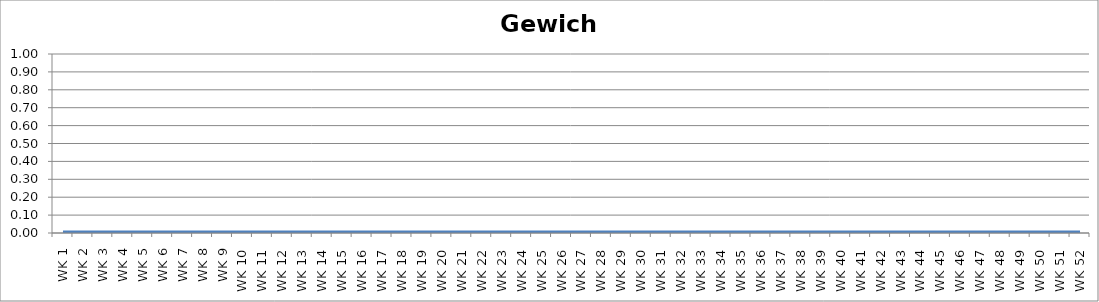
| Category | Kilogramm |
|---|---|
| WK 1 | 0 |
| WK 2 | 0 |
| WK 3 | 0 |
| WK 4 | 0 |
| WK 5 | 0 |
| WK 6 | 0 |
| WK 7 | 0 |
| WK 8 | 0 |
| WK 9 | 0 |
| WK 10 | 0 |
| WK 11 | 0 |
| WK 12 | 0 |
| WK 13 | 0 |
| WK 14 | 0 |
| WK 15 | 0 |
| WK 16 | 0 |
| WK 17 | 0 |
| WK 18 | 0 |
| WK 19 | 0 |
| WK 20 | 0 |
| WK 21 | 0 |
| WK 22 | 0 |
| WK 23 | 0 |
| WK 24 | 0 |
| WK 25 | 0 |
| WK 26 | 0 |
| WK 27 | 0 |
| WK 28 | 0 |
| WK 29 | 0 |
| WK 30 | 0 |
| WK 31 | 0 |
| WK 32 | 0 |
| WK 33 | 0 |
| WK 34 | 0 |
| WK 35 | 0 |
| WK 36 | 0 |
| WK 37 | 0 |
| WK 38 | 0 |
| WK 39 | 0 |
| WK 40 | 0 |
| WK 41 | 0 |
| WK 42 | 0 |
| WK 43 | 0 |
| WK 44 | 0 |
| WK 45 | 0 |
| WK 46 | 0 |
| WK 47 | 0 |
| WK 48 | 0 |
| WK 49 | 0 |
| WK 50 | 0 |
| WK 51 | 0 |
| WK 52 | 0 |